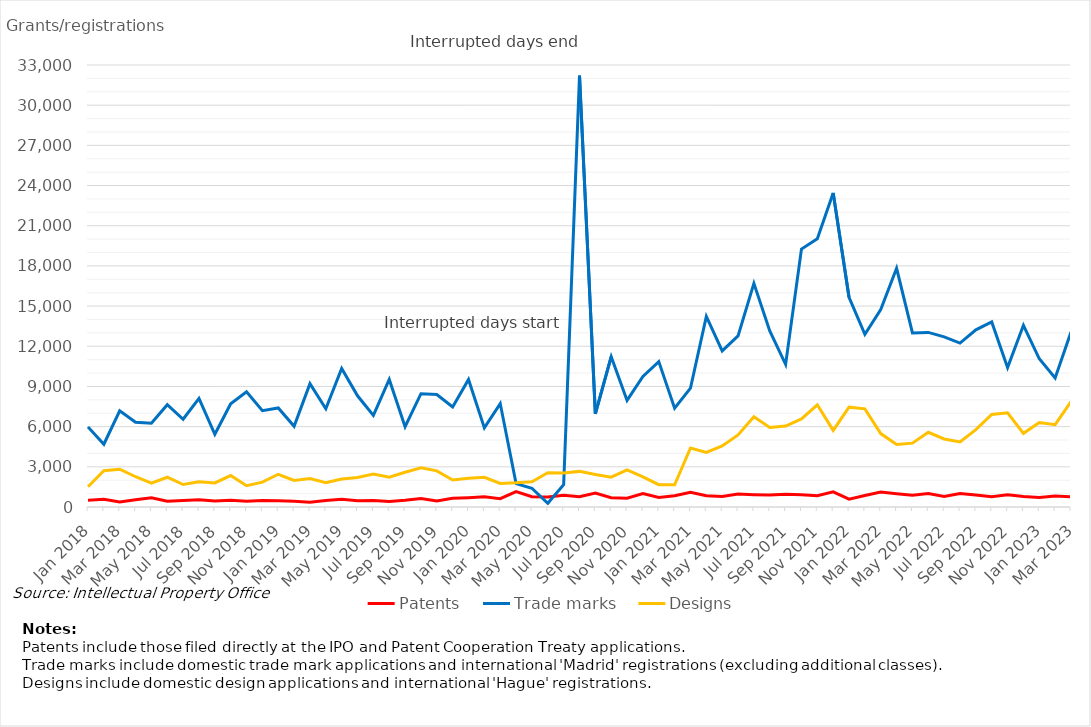
| Category | Patents | Trade marks | Designs |
|---|---|---|---|
| Jan 2018 | 495 | 5979 | 1512 |
| Feb 2018 | 574 | 4687 | 2704 |
| Mar 2018 | 370 | 7179 | 2825 |
| Apr 2018 | 543 | 6334 | 2259 |
| May 2018 | 690 | 6253 | 1789 |
| Jun 2018 | 424 | 7637 | 2222 |
| Jul 2018 | 486 | 6551 | 1678 |
| Aug 2018 | 536 | 8104 | 1878 |
| Sep 2018 | 450 | 5430 | 1795 |
| Oct 2018 | 498 | 7701 | 2348 |
| Nov 2018 | 432 | 8603 | 1592 |
| Dec 2018 | 484 | 7193 | 1859 |
| Jan 2019 | 474 | 7394 | 2444 |
| Feb 2019 | 426 | 6023 | 1987 |
| Mar 2019 | 363 | 9208 | 2125 |
| Apr 2019 | 488 | 7337 | 1810 |
| May 2019 | 573 | 10347 | 2096 |
| Jun 2019 | 471 | 8304 | 2202 |
| Jul 2019 | 489 | 6840 | 2464 |
| Aug 2019 | 420 | 9519 | 2218 |
| Sep 2019 | 500 | 5992 | 2596 |
| Oct 2019 | 634 | 8460 | 2926 |
| Nov 2019 | 455 | 8403 | 2700 |
| Dec 2019 | 654 | 7466 | 2021 |
| Jan 2020 | 696 | 9526 | 2145 |
| Feb 2020 | 756 | 5909 | 2219 |
| Mar 2020 | 622 | 7722 | 1757 |
| Apr 2020 | 1143 | 1743 | 1803 |
| May 2020 | 768 | 1399 | 1888 |
| Jun 2020 | 740 | 282 | 2564 |
| Jul 2020 | 878 | 1660 | 2539 |
| Aug 2020 | 771 | 32204 | 2659 |
| Sep 2020 | 1042 | 6950 | 2425 |
| Oct 2020 | 697 | 11225 | 2223 |
| Nov 2020 | 649 | 7956 | 2763 |
| Dec 2020 | 1010 | 9752 | 2252 |
| Jan 2021 | 708 | 10856 | 1665 |
| Feb 2021 | 838 | 7381 | 1660 |
| Mar 2021 | 1107 | 8879 | 4408 |
| Apr 2021 | 838 | 14233 | 4074 |
| May 2021 | 788 | 11655 | 4562 |
| Jun 2021 | 972 | 12773 | 5385 |
| Jul 2021 | 918 | 16695 | 6731 |
| Aug 2021 | 887 | 13149 | 5944 |
| Sep 2021 | 947 | 10648 | 6041 |
| Oct 2021 | 920 | 19254 | 6577 |
| Nov 2021 | 841 | 20030 | 7629 |
| Dec 2021 | 1131 | 23452 | 5719 |
| Jan 2022 | 585 | 15660 | 7455 |
| Feb 2022 | 860 | 12898 | 7329 |
| Mar 2022 | 1111 | 14744 | 5482 |
| Apr 2022 | 990 | 17821 | 4662 |
| May 2022 | 883 | 12994 | 4767 |
| Jun 2022 | 1010 | 13035 | 5577 |
| Jul 2022 | 788 | 12701 | 5082 |
| Aug 2022 | 1007 | 12236 | 4856 |
| Sep 2022 | 889 | 13227 | 5776 |
| Oct 2022 | 758 | 13818 | 6904 |
| Nov 2022 | 920 | 10405 | 7027 |
| Dec 2022 | 777 | 13567 | 5498 |
| Jan 2023 | 708 | 11067 | 6304 |
| Feb 2023 | 817 | 9631 | 6144 |
| Mar 2023 | 770 | 13058 | 7872 |